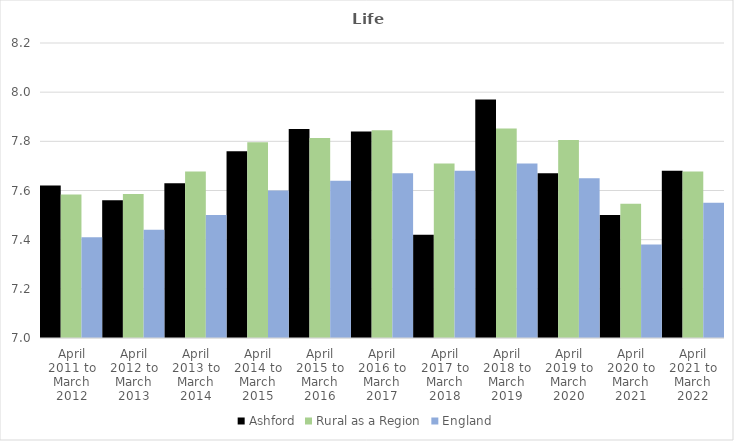
| Category | Ashford | Rural as a Region | England |
|---|---|---|---|
| April 2011 to March 2012 | 7.62 | 7.584 | 7.41 |
| April 2012 to March 2013 | 7.56 | 7.586 | 7.44 |
| April 2013 to March 2014 | 7.63 | 7.677 | 7.5 |
| April 2014 to March 2015 | 7.76 | 7.797 | 7.6 |
| April 2015 to March 2016 | 7.85 | 7.813 | 7.64 |
| April 2016 to March 2017 | 7.84 | 7.845 | 7.67 |
| April 2017 to March 2018 | 7.42 | 7.71 | 7.68 |
| April 2018 to March 2019 | 7.97 | 7.852 | 7.71 |
| April 2019 to March 2020 | 7.67 | 7.806 | 7.65 |
| April 2020 to March 2021 | 7.5 | 7.546 | 7.38 |
| April 2021 to March 2022 | 7.68 | 7.677 | 7.55 |